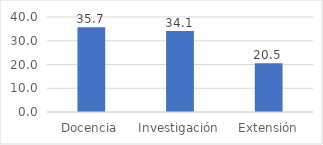
| Category | Series 0 |
|---|---|
| Docencia | 35.7 |
| Investigación | 34.1 |
| Extensión | 20.5 |